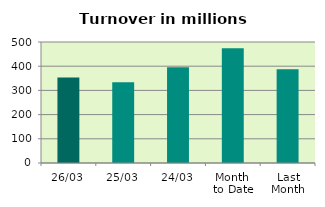
| Category | Series 0 |
|---|---|
| 26/03 | 352.985 |
| 25/03 | 333.801 |
| 24/03 | 395.303 |
| Month 
to Date | 473.773 |
| Last
Month | 387.65 |